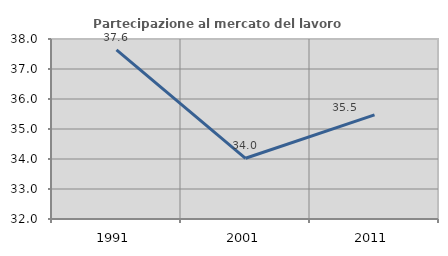
| Category | Partecipazione al mercato del lavoro  femminile |
|---|---|
| 1991.0 | 37.634 |
| 2001.0 | 34.024 |
| 2011.0 | 35.472 |